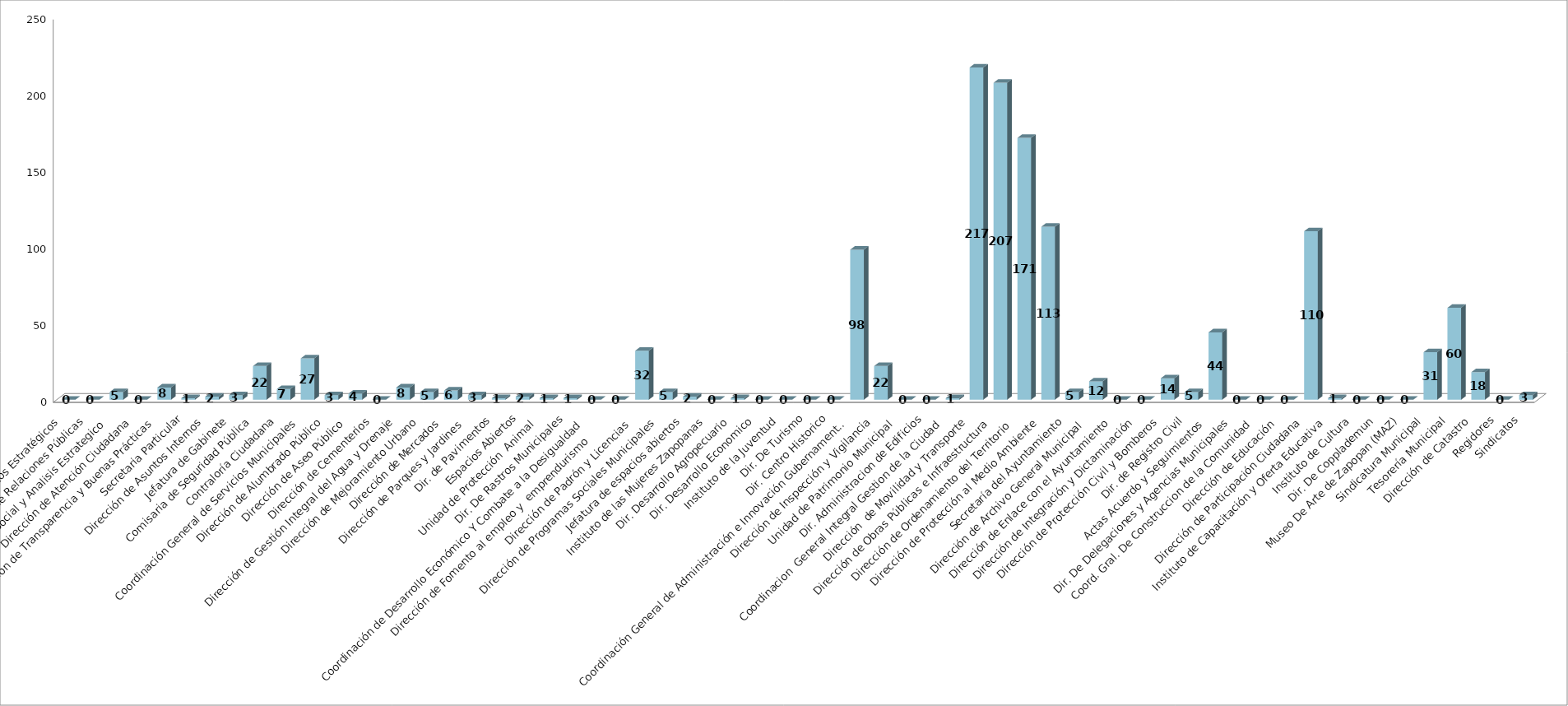
| Category | Series 0 | Series 1 |
|---|---|---|
| Area de Proyectos Estratégicos |  | 0 |
| Área de Relaciones Públicas |  | 0 |
| Comunicación Social y Analisis Estrategico  |  | 5 |
| Dirección de Atención Ciudadana |  | 0 |
| Dirección de Transparencia y Buenas Prácticas |  | 8 |
| Secretaria Particular |  | 1 |
| Dirección de Asuntos Internos |  | 2 |
| Jefatura de Gabinete |  | 3 |
| Comisaria de Seguridad Pública |  | 22 |
| Contraloría Ciudadana |  | 7 |
| Coordinación General de Servicios Municipales |  | 27 |
| Dirección de Alumbrado Público |  | 3 |
| Dirección de Aseo Público  |  | 4 |
| Dirección de Cementerios |  | 0 |
| Dirección de Gestión Integral del Agua y Drenaje |  | 8 |
| Dirección de Mejoramiento Urbano |  | 5 |
| Dirección de Mercados  |  | 6 |
| Dirección de Parques y Jardines  |  | 3 |
| Dir. de Pavimentos |  | 1 |
| Espacios Abiertos |  | 2 |
| Unidad de Protección  Animal  |  | 1 |
| Dir. De Rastros Municipales |  | 1 |
| Coordinación de Desarrollo Económico Y Combate a la Desigualdad |  | 0 |
| Dirección de Fomento al empleo y  emprendurismo         |  | 0 |
| Dirección de Padrón y Licencias  |  | 32 |
| Dirección de Programas Sociales Municipales |  | 5 |
| Jefatura de espacios abiertos |  | 2 |
| Instituto de las Mujeres Zapopanas |  | 0 |
|  Dir. Desarrollo Agropecuario |  | 1 |
| Dir. Desarrollo Economico |  | 0 |
| Instituto de la Juventud |  | 0 |
| Dir. De Turismo |  | 0 |
| Dir. Centro Historico |  | 0 |
| Coordinación General de Administración e Innovación Gubernamental |  | 98 |
| Dirección de Inspección y Vigilancia |  | 22 |
| Unidad de Patrimonio Municipal  |  | 0 |
| Dir. Administracion de Edificios |  | 0 |
| Coordinacion  General Integral Gestion de la Ciudad |  | 1 |
| Dirección  de Movilidad y Transporte |  | 217 |
| Dirección de Obras Públicas e Infraestructura |  | 207 |
| Dirección de Ordenamiento del Territorio  |  | 171 |
| Dirección de Protección al Medio Ambiente  |  | 113 |
| Secretaría del Ayuntamiento |  | 5 |
| Dirección de Archivo General Municipal  |  | 12 |
| Dirección de Enlace con el Ayuntamiento |  | 0 |
| Dirección de Integración y Dictaminación |  | 0 |
| Dirección de Protección Civil y Bomberos |  | 14 |
| Dir. de Registro Civil |  | 5 |
| Actas Acuerdo y Seguimientos  |  | 44 |
| Dir. De Delegaciones y Agencias Municipales |  | 0 |
| Coord. Gral. De Construccion de la Comunidad |  | 0 |
| Dirección de Educación  |  | 0 |
| Dirección de Participación Ciudadana |  | 110 |
| Instituto de Capacitación y Oferta Educativa |  | 1 |
| Instituto de Cultura  |  | 0 |
| Dir. De Copplademun |  | 0 |
| Museo De Arte de Zapopan (MAZ) |  | 0 |
| Sindicatura Municipal |  | 31 |
| Tesorería Municipal |  | 60 |
| Dirección de Catastro |  | 18 |
| Regidores |  | 0 |
| Sindicatos |  | 3 |